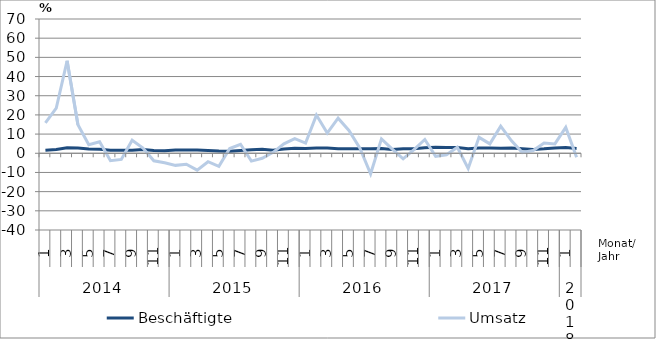
| Category | Beschäftigte | Umsatz |
|---|---|---|
| 0 | 1.6 | 15.9 |
| 1 | 2 | 23.5 |
| 2 | 2.9 | 48.2 |
| 3 | 2.8 | 14.9 |
| 4 | 2.2 | 4.5 |
| 5 | 2.1 | 6 |
| 6 | 1.6 | -3.9 |
| 7 | 1.6 | -3.2 |
| 8 | 1.6 | 6.8 |
| 9 | 2 | 2.7 |
| 10 | 1.4 | -3.9 |
| 11 | 1.3 | -4.9 |
| 12 | 1.7 | -6.3 |
| 13 | 1.7 | -5.7 |
| 14 | 1.7 | -8.8 |
| 15 | 1.5 | -4.4 |
| 16 | 1.2 | -6.8 |
| 17 | 1.1 | 2.5 |
| 18 | 1.5 | 4.7 |
| 19 | 1.8 | -4.1 |
| 20 | 2.1 | -2.6 |
| 21 | 1.6 | 0.5 |
| 22 | 2.2 | 4.9 |
| 23 | 2.6 | 7.6 |
| 24 | 2.5 | 5.3 |
| 25 | 2.7 | 19.9 |
| 26 | 2.8 | 10.5 |
| 27 | 2.4 | 18.3 |
| 28 | 2.4 | 11.9 |
| 29 | 2.4 | 2.8 |
| 30 | 2.3 | -10.7 |
| 31 | 2.5 | 7.5 |
| 32 | 2 | 2.2 |
| 33 | 2.4 | -2.9 |
| 34 | 2.3 | 1.9 |
| 35 | 2.9 | 7.2 |
| 36 | 3.1 | -1.6 |
| 37 | 3 | -0.8 |
| 38 | 3 | 3.1 |
| 39 | 2.4 | -7.9 |
| 40 | 2.8 | 8.3 |
| 41 | 2.7 | 4.9 |
| 42 | 2.6 | 14.1 |
| 43 | 2.7 | 6.5 |
| 44 | 2.3 | 0.4 |
| 45 | 2 | 1.4 |
| 46 | 2.3 | 5.3 |
| 47 | 2.8 | 4.9 |
| 48 | 3 | 13.5 |
| 49 | 2.5 | -2.1 |